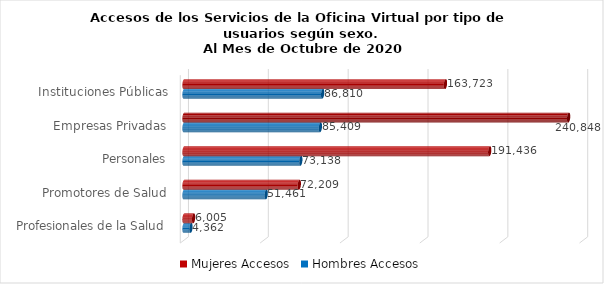
| Category | Mujeres | Hombres |
|---|---|---|
| Instituciones Públicas | 163723 | 86810 |
| Empresas Privadas | 240848 | 85409 |
| Personales | 191436 | 73138 |
| Promotores de Salud | 72209 | 51461 |
| Profesionales de la Salud | 6005 | 4362 |